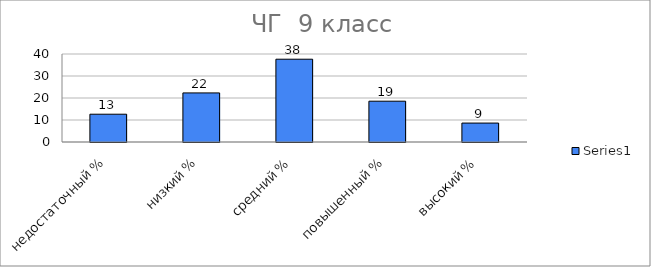
| Category | Series 0 |
|---|---|
| недостаточный % | 12.634 |
| низкий % | 22.312 |
| средний % | 37.634 |
| повышенный % | 18.548 |
| высокий % | 8.602 |